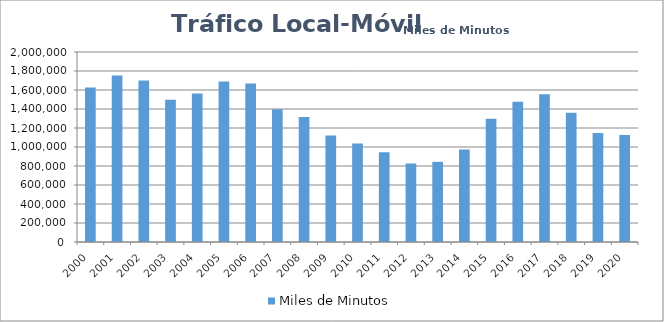
| Category | Miles de Minutos |
|---|---|
| 2000 | 1627028 |
| 2001 | 1752982 |
| 2002 | 1700120 |
| 2003 | 1497591 |
| 2004 | 1562293 |
| 2005 | 1690428 |
| 2006 | 1668463.423 |
| 2007 | 1397811.019 |
| 2008 | 1314507.034 |
| 2009 | 1120321.35 |
| 2010 | 1037043.938 |
| 2011 | 944322.029 |
| 2012 | 826511.145 |
| 2013 | 844044.583 |
| 2014 | 973602.636 |
| 2015 | 1296335.952 |
| 2016 | 1477242.661 |
| 2017 | 1554908.525 |
| 2018 | 1360456.758 |
| 2019 | 1148683.524 |
| 2020 | 1127216.818 |